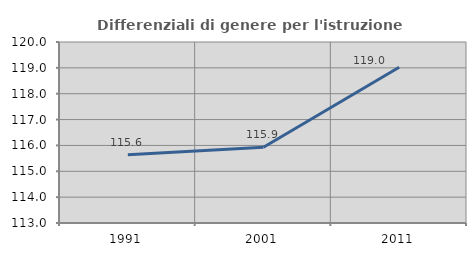
| Category | Differenziali di genere per l'istruzione superiore |
|---|---|
| 1991.0 | 115.639 |
| 2001.0 | 115.933 |
| 2011.0 | 119.02 |